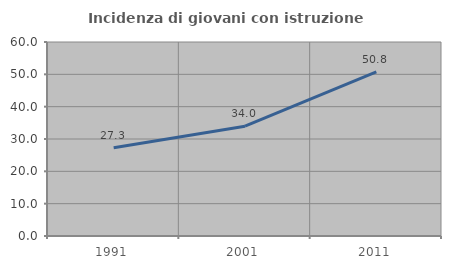
| Category | Incidenza di giovani con istruzione universitaria |
|---|---|
| 1991.0 | 27.278 |
| 2001.0 | 33.955 |
| 2011.0 | 50.774 |